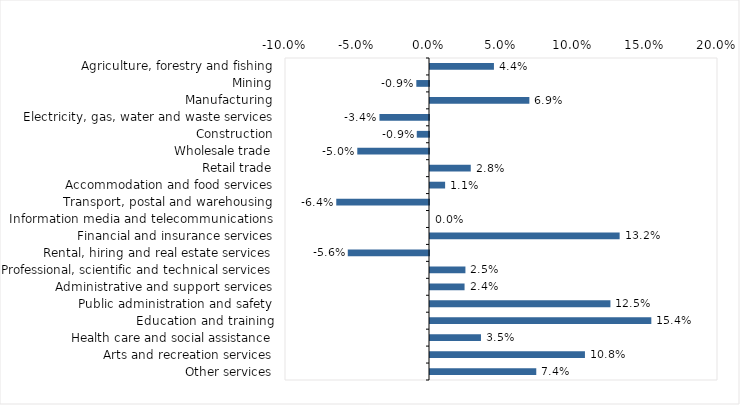
| Category | This week |
|---|---|
| Agriculture, forestry and fishing | 0.044 |
| Mining | -0.009 |
| Manufacturing | 0.069 |
| Electricity, gas, water and waste services | -0.034 |
| Construction | -0.008 |
| Wholesale trade | -0.05 |
| Retail trade | 0.028 |
| Accommodation and food services | 0.01 |
| Transport, postal and warehousing | -0.064 |
| Information media and telecommunications | 0 |
| Financial and insurance services | 0.132 |
| Rental, hiring and real estate services | -0.056 |
| Professional, scientific and technical services | 0.025 |
| Administrative and support services | 0.024 |
| Public administration and safety | 0.125 |
| Education and training | 0.154 |
| Health care and social assistance | 0.035 |
| Arts and recreation services | 0.108 |
| Other services | 0.074 |